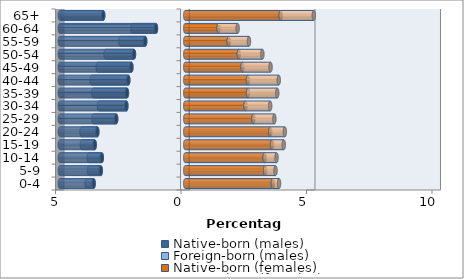
| Category | Native-born (males) | Foreign-born (males) | Native-born (females) | Foreign-born (females) |
|---|---|---|---|---|
| 0-4 | -3.65 | -0.282 | 3.49 | 0.247 |
| 5-9 | -3.366 | -0.464 | 3.181 | 0.416 |
| 10-14 | -3.325 | -0.522 | 3.161 | 0.477 |
| 15-19 | -3.608 | -0.51 | 3.455 | 0.469 |
| 20-24 | -3.504 | -0.629 | 3.387 | 0.581 |
| 25-29 | -2.752 | -0.906 | 2.715 | 0.836 |
| 30-34 | -2.347 | -1.093 | 2.397 | 0.987 |
| 35-39 | -2.324 | -1.34 | 2.502 | 1.163 |
| 40-44 | -2.269 | -1.46 | 2.496 | 1.229 |
| 45-49 | -2.147 | -1.341 | 2.279 | 1.12 |
| 50-54 | -2.043 | -1.132 | 2.134 | 0.938 |
| 55-59 | -1.596 | -0.988 | 1.732 | 0.807 |
| 60-64 | -1.168 | -0.939 | 1.325 | 0.762 |
| 65+ | -3.269 | -1.62 | 3.805 | 1.317 |